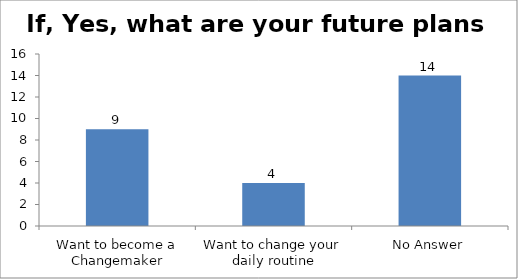
| Category | If, Yes, what are your future plans now? |
|---|---|
| Want to become a Changemaker | 9 |
| Want to change your daily routine | 4 |
| No Answer | 14 |